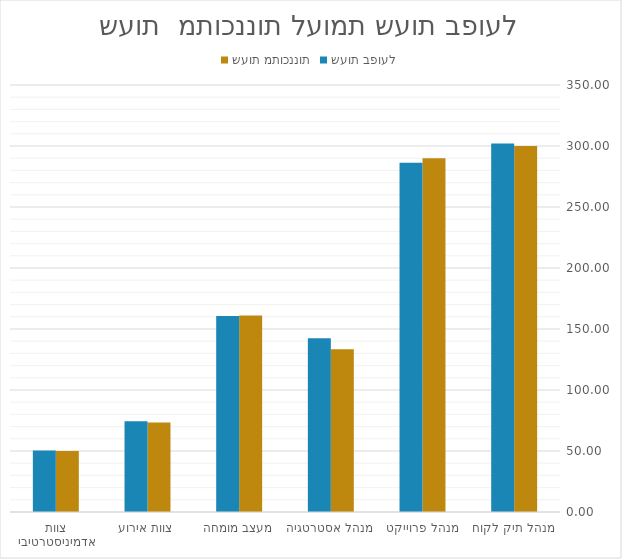
| Category | שעות מתוכננות | שעות בפועל |
|---|---|---|
| מנהל תיק לקוח | 300 | 302 |
| מנהל פרוייקט | 290 | 286.333 |
| מנהל אסטרטגיה | 133.333 | 142.5 |
| מעצב מומחה | 161.111 | 160.556 |
| צוות אירוע | 73.333 | 74.444 |
| צוות אדמיניסטרטיבי | 50 | 50.333 |